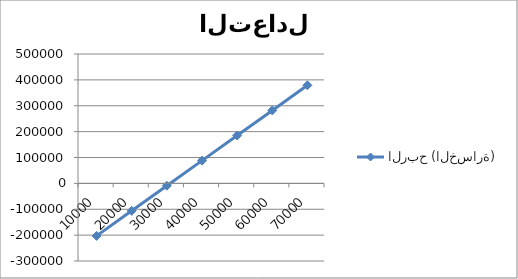
| Category | الربح (الخسارة) |
|---|---|
| 10000.0 | -203000 |
| 20000.0 | -106000 |
| 30000.0 | -9000 |
| 40000.0 | 88000 |
| 50000.0 | 185000 |
| 60000.0 | 282000 |
| 70000.0 | 379000 |